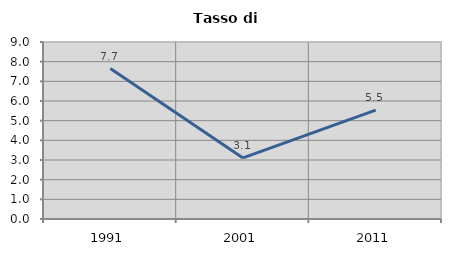
| Category | Tasso di disoccupazione   |
|---|---|
| 1991.0 | 7.65 |
| 2001.0 | 3.106 |
| 2011.0 | 5.534 |